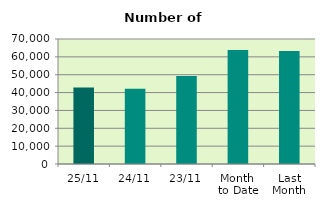
| Category | Series 0 |
|---|---|
| 25/11 | 42842 |
| 24/11 | 42176 |
| 23/11 | 49308 |
| Month 
to Date | 63895.684 |
| Last
Month | 63348.667 |